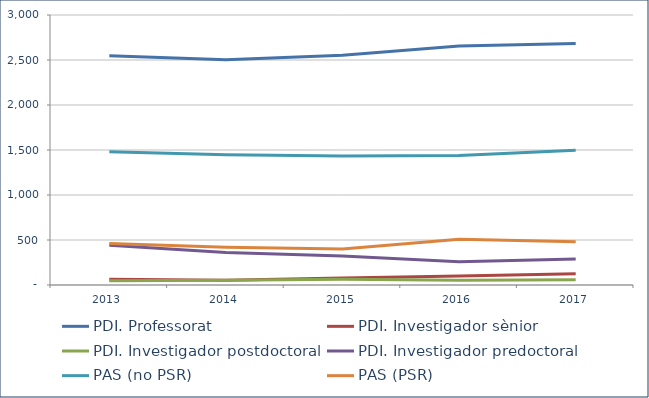
| Category | PDI. Professorat | PDI. Investigador sènior | PDI. Investigador postdoctoral | PDI. Investigador predoctoral | PAS (no PSR) | PAS (PSR) |
|---|---|---|---|---|---|---|
| 2013.0 | 2547 | 64 | 46 | 441 | 1480 | 461 |
| 2014.0 | 2502 | 53 | 52 | 361 | 1446 | 419 |
| 2015.0 | 2552 | 79 | 63 | 321 | 1432 | 400 |
| 2016.0 | 2656 | 99 | 52 | 259 | 1438 | 508 |
| 2017.0 | 2684 | 125 | 59 | 290 | 1497 | 481 |